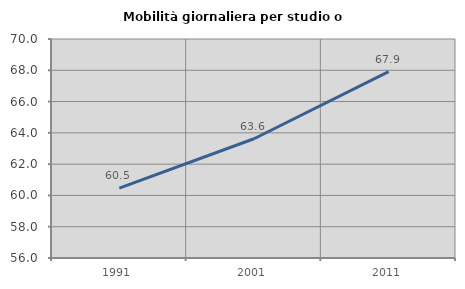
| Category | Mobilità giornaliera per studio o lavoro |
|---|---|
| 1991.0 | 60.462 |
| 2001.0 | 63.623 |
| 2011.0 | 67.914 |